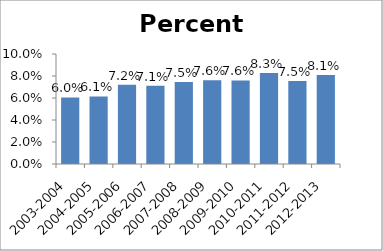
| Category | Percent Minority |
|---|---|
| 2003-2004 | 0.06 |
| 2004-2005 | 0.061 |
| 2005-2006 | 0.072 |
| 2006-2007 | 0.071 |
| 2007-2008 | 0.075 |
| 2008-2009 | 0.076 |
| 2009-2010 | 0.076 |
| 2010-2011 | 0.083 |
| 2011-2012 | 0.075 |
| 2012-2013 | 0.081 |